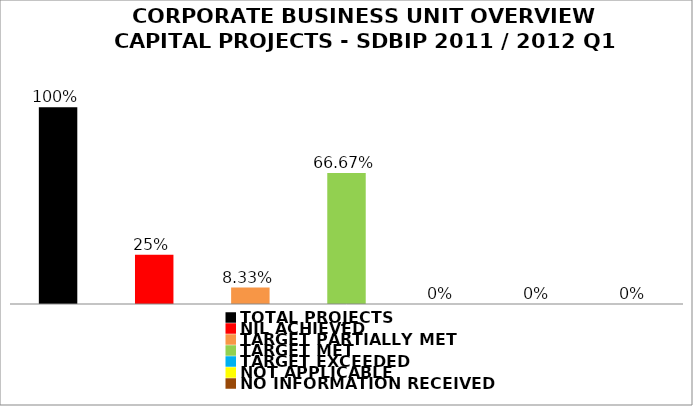
| Category | Series 1 |
|---|---|
| TOTAL PROJECTS | 1 |
| NIL ACHIEVED | 0.25 |
| TARGET PARTIALLY MET | 0.083 |
| TARGET MET | 0.667 |
| TARGET EXCEEDED | 0 |
| NOT APPLICABLE | 0 |
| NO INFORMATION RECEIVED | 0 |